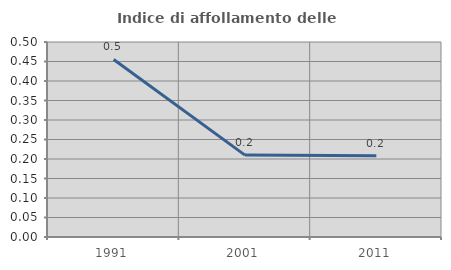
| Category | Indice di affollamento delle abitazioni  |
|---|---|
| 1991.0 | 0.455 |
| 2001.0 | 0.21 |
| 2011.0 | 0.209 |